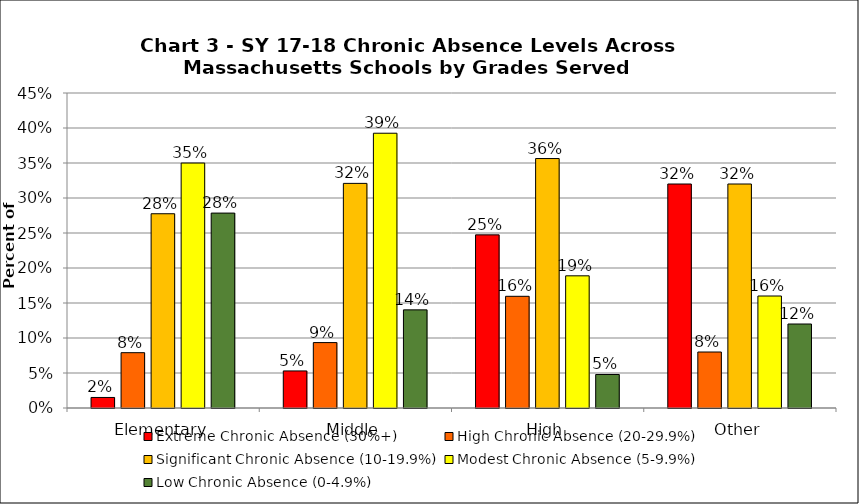
| Category | Extreme Chronic Absence (30%+) | High Chronic Absence (20-29.9%) | Significant Chronic Absence (10-19.9%) | Modest Chronic Absence (5-9.9%) | Low Chronic Absence (0-4.9%) |
|---|---|---|---|---|---|
| 0 | 0.015 | 0.079 | 0.278 | 0.35 | 0.278 |
| 1 | 0.053 | 0.093 | 0.321 | 0.393 | 0.14 |
| 2 | 0.247 | 0.16 | 0.356 | 0.189 | 0.048 |
| 3 | 0.32 | 0.08 | 0.32 | 0.16 | 0.12 |